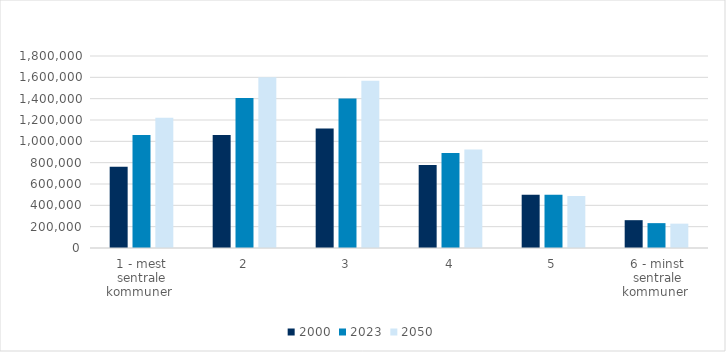
| Category | 2000 | 2023 | 2050 |
|---|---|---|---|
| 1 - mest sentrale kommuner  | 761411 | 1059086 | 1220580 |
| 2 | 1058640 | 1405274 | 1601286 |
| 3 | 1119880 | 1400922 | 1568617 |
| 4 | 778151.86 | 890429 | 922863 |
| 5 | 499584.18 | 500195 | 487319 |
| 6 - minst sentrale kommuner  | 260829.96 | 233078 | 228165 |